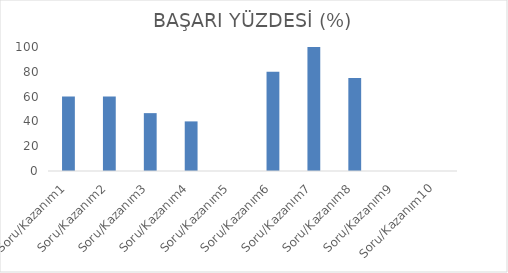
| Category | BAŞARI YÜZDESİ (%) |
|---|---|
| Soru/Kazanım1 | 60 |
| Soru/Kazanım2 | 60 |
| Soru/Kazanım3 | 46.667 |
| Soru/Kazanım4 | 40 |
| Soru/Kazanım5 | 0 |
| Soru/Kazanım6 | 80 |
| Soru/Kazanım7 | 100 |
| Soru/Kazanım8 | 75 |
| Soru/Kazanım9 | 0 |
| Soru/Kazanım10 | 0 |